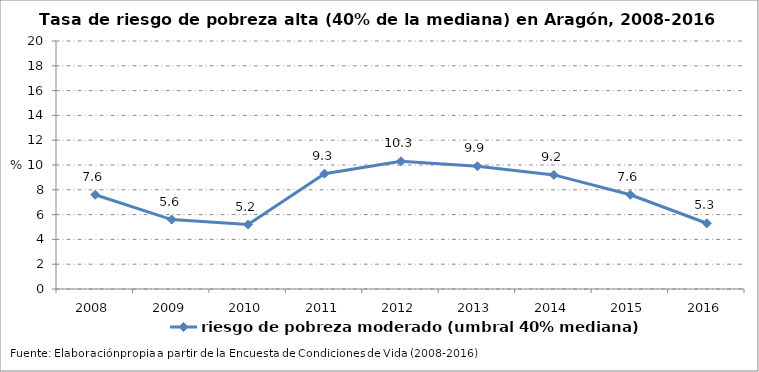
| Category | riesgo de pobreza moderado (umbral 40% mediana) |
|---|---|
| 2008.0 | 7.6 |
| 2009.0 | 5.6 |
| 2010.0 | 5.2 |
| 2011.0 | 9.3 |
| 2012.0 | 10.3 |
| 2013.0 | 9.9 |
| 2014.0 | 9.2 |
| 2015.0 | 7.6 |
| 2016.0 | 5.3 |